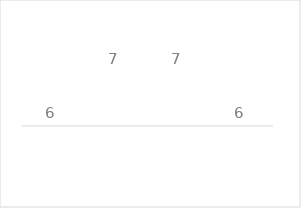
| Category | Total |
|---|---|
| Ali | 6 |
| Mohammed | 7 |
| Nasser | 7 |
| Yaser | 6 |